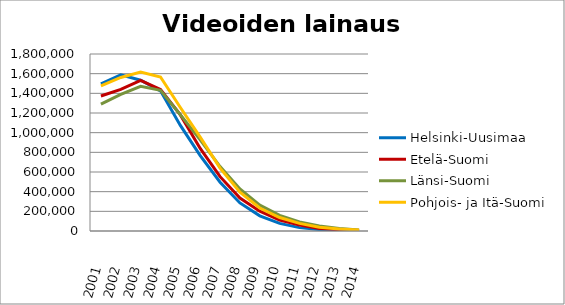
| Category | Helsinki-Uusimaa | Etelä-Suomi | Länsi-Suomi | Pohjois- ja Itä-Suomi |
|---|---|---|---|---|
| 2001.0 | 1496416 | 1372812 | 1289632 | 1475905 |
| 2002.0 | 1588285 | 1440682 | 1390292 | 1561428 |
| 2003.0 | 1533589 | 1531358 | 1471192 | 1615543 |
| 2004.0 | 1425154 | 1438866 | 1430173 | 1566202 |
| 2005.0 | 1073563 | 1180739 | 1182201 | 1255355 |
| 2006.0 | 767033 | 839354 | 927443 | 954658 |
| 2007.0 | 495877 | 552471 | 655586 | 639880 |
| 2008.0 | 285144 | 335173 | 428037 | 394320 |
| 2009.0 | 154111 | 201273 | 262658 | 233714 |
| 2010.0 | 77543 | 111053 | 158909 | 137245 |
| 2011.0 | 34174 | 60507 | 92458 | 77650 |
| 2012.0 | 14976 | 26609 | 50906 | 38981 |
| 2013.0 | 7582 | 13500 | 25300 | 20506 |
| 2014.0 | 4682 | 5581 | 11346 | 10396 |